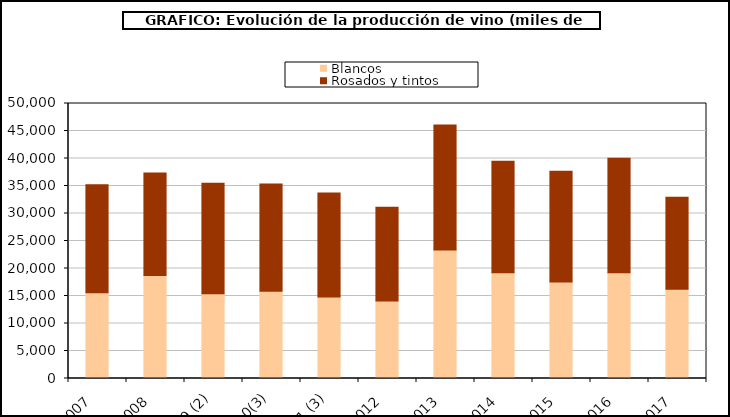
| Category | Blancos | Rosados y tintos |
|---|---|---|
| 2007  | 15606.689 | 19602.025 |
| 2008  | 18734.905 | 18631.987 |
| 2009 (2) | 15387.014 | 20102.28 |
| 2010(3) | 15875.53 | 19477.944 |
| 2011 (3) | 14820.108 | 18889.015 |
| 2012  | 14069.736 | 17052.824 |
| 2013  | 23343.372 | 22735.173 |
| 2014  | 19206.264 | 20287.417 |
| 2015  | 17539.622 | 20162.903 |
| 2016  | 19213.073 | 20826.807 |
| 2017  | 16231.668 | 16738.51 |